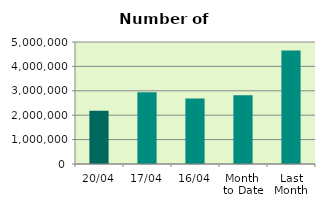
| Category | Series 0 |
|---|---|
| 20/04 | 2183562 |
| 17/04 | 2943426 |
| 16/04 | 2685852 |
| Month 
to Date | 2822117.667 |
| Last
Month | 4654844.727 |